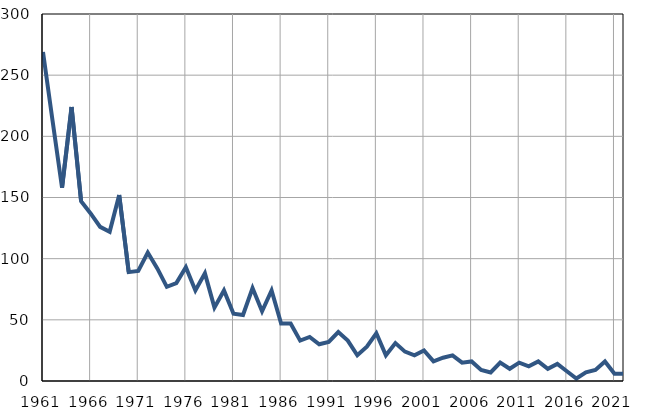
| Category | Infants
deaths |
|---|---|
| 1961.0 | 269 |
| 1962.0 | 213 |
| 1963.0 | 158 |
| 1964.0 | 224 |
| 1965.0 | 147 |
| 1966.0 | 137 |
| 1967.0 | 126 |
| 1968.0 | 122 |
| 1969.0 | 152 |
| 1970.0 | 89 |
| 1971.0 | 90 |
| 1972.0 | 105 |
| 1973.0 | 92 |
| 1974.0 | 77 |
| 1975.0 | 80 |
| 1976.0 | 93 |
| 1977.0 | 74 |
| 1978.0 | 88 |
| 1979.0 | 60 |
| 1980.0 | 74 |
| 1981.0 | 55 |
| 1982.0 | 54 |
| 1983.0 | 76 |
| 1984.0 | 57 |
| 1985.0 | 74 |
| 1986.0 | 47 |
| 1987.0 | 47 |
| 1988.0 | 33 |
| 1989.0 | 36 |
| 1990.0 | 30 |
| 1991.0 | 32 |
| 1992.0 | 40 |
| 1993.0 | 33 |
| 1994.0 | 21 |
| 1995.0 | 28 |
| 1996.0 | 39 |
| 1997.0 | 21 |
| 1998.0 | 31 |
| 1999.0 | 24 |
| 2000.0 | 21 |
| 2001.0 | 25 |
| 2002.0 | 16 |
| 2003.0 | 19 |
| 2004.0 | 21 |
| 2005.0 | 15 |
| 2006.0 | 16 |
| 2007.0 | 9 |
| 2008.0 | 7 |
| 2009.0 | 15 |
| 2010.0 | 10 |
| 2011.0 | 15 |
| 2012.0 | 12 |
| 2013.0 | 16 |
| 2014.0 | 10 |
| 2015.0 | 14 |
| 2016.0 | 8 |
| 2017.0 | 2 |
| 2018.0 | 7 |
| 2019.0 | 9 |
| 2020.0 | 16 |
| 2021.0 | 6 |
| 2022.0 | 6 |